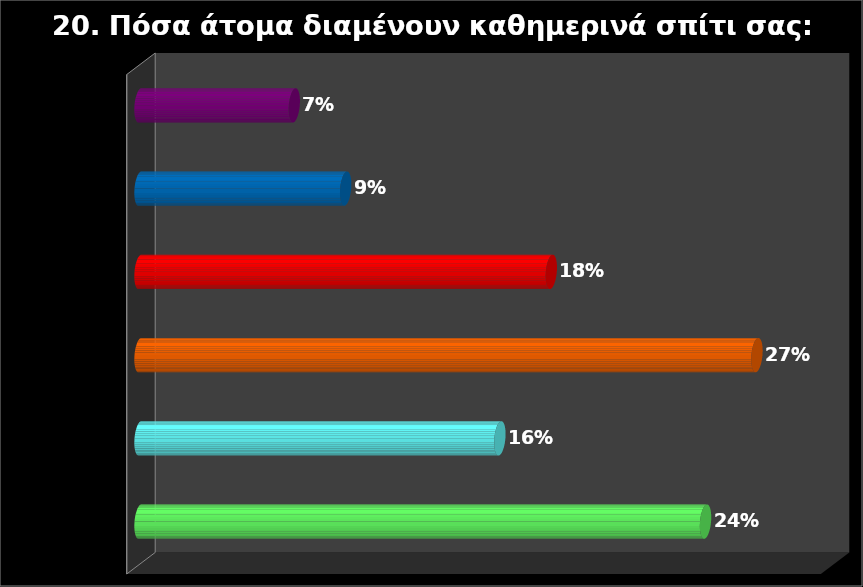
| Category | Series 0 |
|---|---|
| Εγώ μόνο | 0.244 |
| Δύο  | 0.156 |
| Τρία  | 0.267 |
| Τέσσερα  | 0.178 |
| Πέντε  | 0.089 |
| Έξι  | 0.067 |